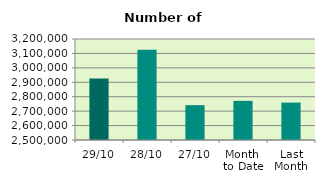
| Category | Series 0 |
|---|---|
| 29/10 | 2925636 |
| 28/10 | 3125100 |
| 27/10 | 2741462 |
| Month 
to Date | 2771381.143 |
| Last
Month | 2759252.364 |